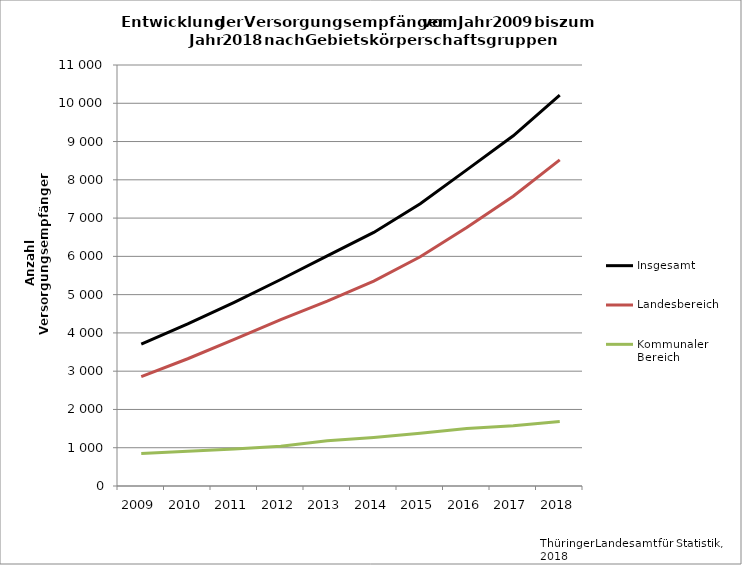
| Category | Insgesamt | Landesbereich | Kommunaler Bereich |
|---|---|---|---|
| 2009.0 | 3710 | 2860 | 850 |
| 2010.0 | 4235 | 3325 | 910 |
| 2011.0 | 4800 | 3830 | 965 |
| 2012.0 | 5395 | 4350 | 1040 |
| 2013.0 | 6015 | 4830 | 1180 |
| 2014.0 | 6625 | 5355 | 1270 |
| 2015.0 | 7375 | 5990 | 1380 |
| 2016.0 | 8260 | 6755 | 1500 |
| 2017.0 | 9150 | 7570 | 1575 |
| 2018.0 | 10210 | 8520 | 1685 |